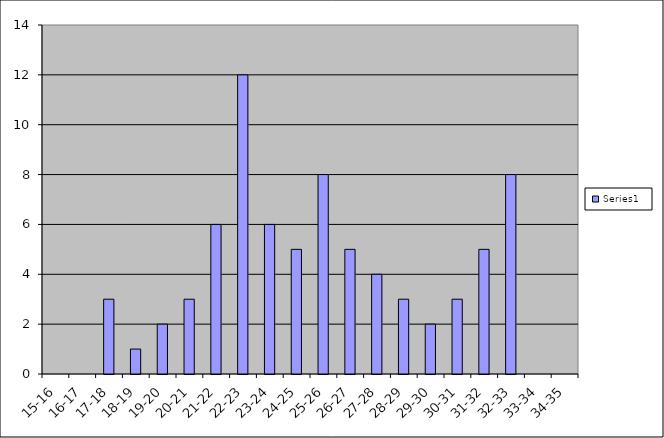
| Category | Series 0 |
|---|---|
| 15-16 | 0 |
| 16-17 | 0 |
| 17-18 | 3 |
| 18-19 | 1 |
| 19-20 | 2 |
| 20-21 | 3 |
| 21-22 | 6 |
| 22-23 | 12 |
| 23-24 | 6 |
| 24-25 | 5 |
| 25-26 | 8 |
| 26-27 | 5 |
| 27-28 | 4 |
| 28-29 | 3 |
| 29-30 | 2 |
| 30-31 | 3 |
| 31-32 | 5 |
| 32-33 | 8 |
| 33-34 | 0 |
| 34-35 | 0 |